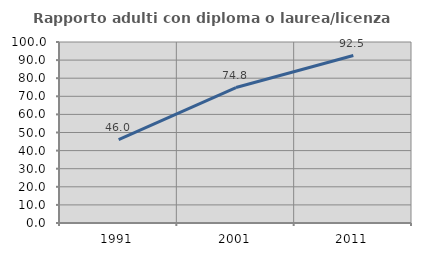
| Category | Rapporto adulti con diploma o laurea/licenza media  |
|---|---|
| 1991.0 | 46.024 |
| 2001.0 | 74.836 |
| 2011.0 | 92.506 |